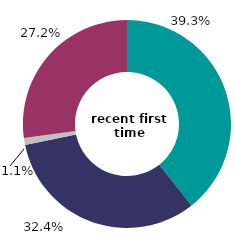
| Category | recent first time buyers  |
|---|---|
| couple with no children | 39.349 |
| couple with dependent children | 32.435 |
| lone parent with dependent children | 1.056 |
| other type of household | 27.16 |